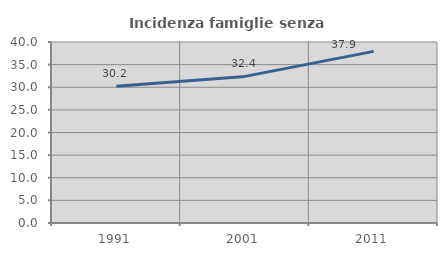
| Category | Incidenza famiglie senza nuclei |
|---|---|
| 1991.0 | 30.211 |
| 2001.0 | 32.401 |
| 2011.0 | 37.931 |